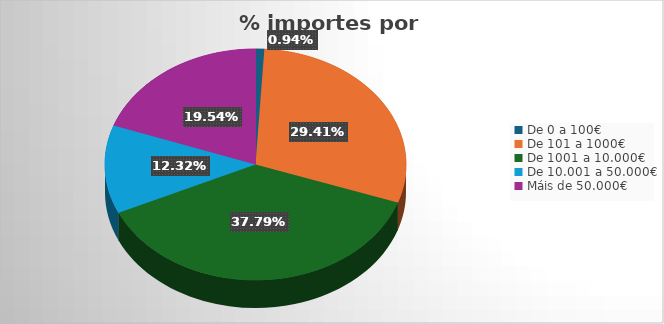
| Category | Local | Rexional | Nacional | Estranxeiro | Total |
|---|---|---|---|---|---|
| De 0 a 100€ | 0.009 | 0.001 | 0.003 | 0 | 0.009 |
| De 101 a 1000€ | 0.294 | 0.018 | 0.161 | 0.013 | 0.294 |
| De 1001 a 10.000€ | 0.378 | 0.051 | 0.136 | 0.023 | 0.378 |
| De 10.001 a 50.000€ | 0.123 | 0.011 | 0.033 | 0.008 | 0.123 |
| Máis de 50.000€ | 0.195 | 0 | 0.138 | 0.002 | 0.195 |